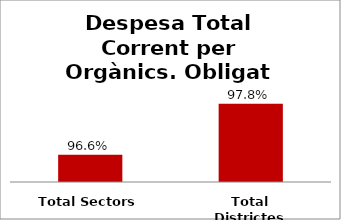
| Category | Series 0 |
|---|---|
| Total Sectors | 0.966 |
| Total Districtes | 0.978 |